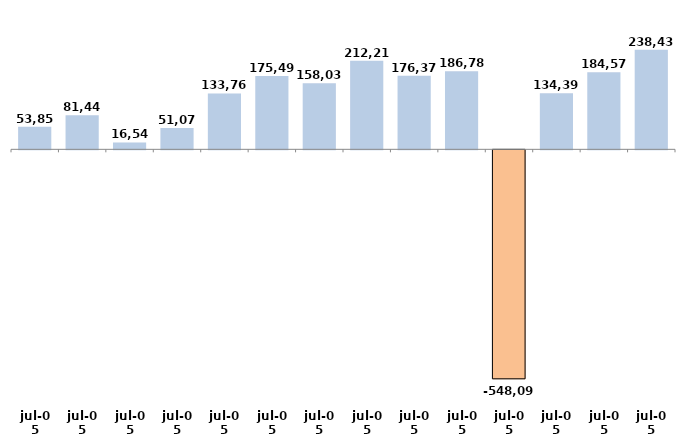
| Category | Series 0 |
|---|---|
| 1905-07-02 | 53851.71 |
| 1905-07-03 | 81446.57 |
| 1905-07-04 | 16548.79 |
| 1905-07-05 | 51077.47 |
| 1905-07-06 | 133764.72 |
| 1905-07-07 | 175495.4 |
| 1905-07-08 | 158037.61 |
| 1905-07-09 | 212215.67 |
| 1905-07-10 | 176373.25 |
| 1905-07-11 | 186785.42 |
| 1905-07-12 | -548092.791 |
| 1905-07-13 | 134396 |
| 1905-07-14 | 184576 |
| 1905-07-15 | 238436.251 |